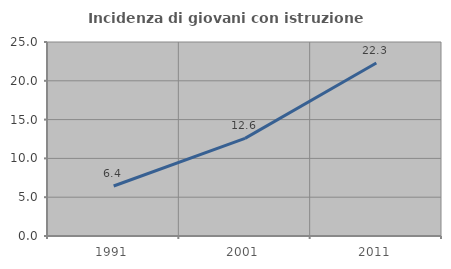
| Category | Incidenza di giovani con istruzione universitaria |
|---|---|
| 1991.0 | 6.439 |
| 2001.0 | 12.581 |
| 2011.0 | 22.302 |